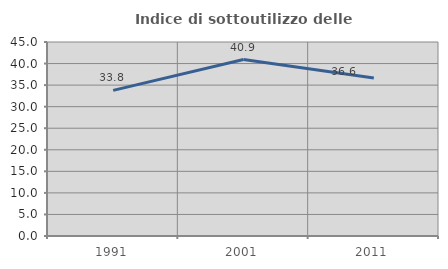
| Category | Indice di sottoutilizzo delle abitazioni  |
|---|---|
| 1991.0 | 33.775 |
| 2001.0 | 40.936 |
| 2011.0 | 36.628 |